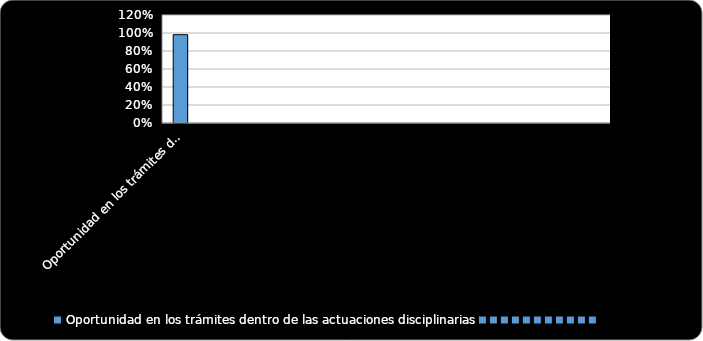
| Category | % Cumplimiento  |
|---|---|
| Oportunidad en los trámites dentro de las actuaciones disciplinarias | 0.981 |